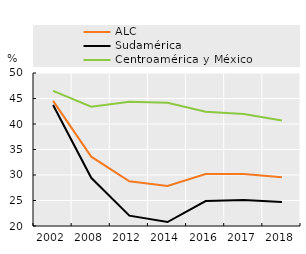
| Category | ALC | Sudamérica | Centroamérica y México |
|---|---|---|---|
| 2002.0 | 44.535 | 43.714 | 46.5 |
| 2008.0 | 33.592 | 29.447 | 43.373 |
| 2012.0 | 28.755 | 22.027 | 44.38 |
| 2014.0 | 27.846 | 20.774 | 44.158 |
| 2016.0 | 30.205 | 24.887 | 42.386 |
| 2017.0 | 30.216 | 25.075 | 41.947 |
| 2018.0 | 29.567 | 24.685 | 40.668 |